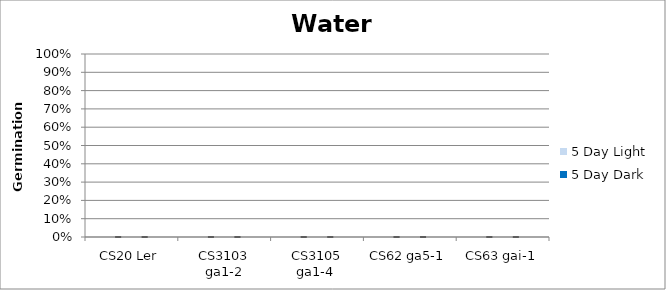
| Category | 5 Day Light | 5 Day Dark |
|---|---|---|
| CS20 Ler | 0 | 0 |
| CS3103 ga1-2 | 0 | 0 |
| CS3105 ga1-4  | 0 | 0 |
| CS62 ga5-1 | 0 | 0 |
| CS63 gai-1 | 0 | 0 |